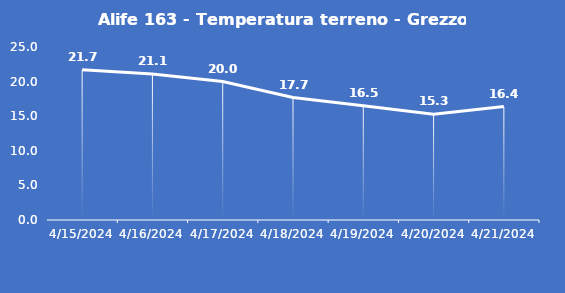
| Category | Alife 163 - Temperatura terreno - Grezzo (°C) |
|---|---|
| 4/15/24 | 21.7 |
| 4/16/24 | 21.1 |
| 4/17/24 | 20 |
| 4/18/24 | 17.7 |
| 4/19/24 | 16.5 |
| 4/20/24 | 15.3 |
| 4/21/24 | 16.4 |